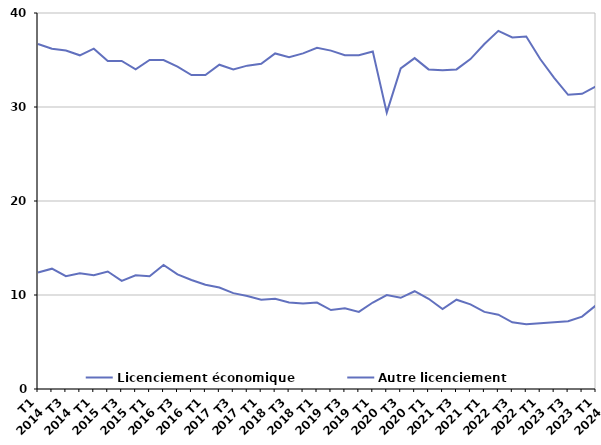
| Category | Licenciement économique | Autre licenciement |
|---|---|---|
| T1
2014 | 12.4 | 36.7 |
| T2
2014 | 12.8 | 36.2 |
| T3
2014 | 12 | 36 |
| T4
2014 | 12.3 | 35.5 |
| T1
2015 | 12.1 | 36.2 |
| T2
2015 | 12.5 | 34.9 |
| T3
2015 | 11.5 | 34.9 |
| T4
2015 | 12.1 | 34 |
| T1
2016 | 12 | 35 |
| T2
2016 | 13.2 | 35 |
| T3
2016 | 12.2 | 34.3 |
| T4
2016 | 11.6 | 33.4 |
| T1
2017 | 11.1 | 33.4 |
| T2
2017 | 10.8 | 34.5 |
| T3
2017 | 10.2 | 34 |
| T4
2017 | 9.9 | 34.4 |
| T1
2018 | 9.5 | 34.6 |
| T2
2018 | 9.6 | 35.7 |
| T3
2018 | 9.2 | 35.3 |
| T4
2018 | 9.1 | 35.7 |
| T1
2019 | 9.2 | 36.3 |
| T2
2019 | 8.4 | 36 |
| T3
2019 | 8.6 | 35.5 |
| T4
2019 | 8.2 | 35.5 |
| T1
2020 | 9.2 | 35.9 |
| T2
2020 | 10 | 29.4 |
| T3
2020 | 9.7 | 34.1 |
| T4
2020 | 10.4 | 35.2 |
| T1
2021 | 9.6 | 34 |
| T2
2021 | 8.5 | 33.9 |
| T3
2021 | 9.5 | 34 |
| T4
2021 | 9 | 35.1 |
| T1
2022 | 8.2 | 36.7 |
| T2
2022 | 7.9 | 38.1 |
| T3
2022 | 7.1 | 37.4 |
| T4
2022 | 6.9 | 37.5 |
| T1
2023 | 7 | 35.1 |
| T2
2023 | 7.1 | 33.1 |
| T3
2023 | 7.2 | 31.3 |
| T4
2023 | 7.7 | 31.4 |
| T1
2024 | 8.9 | 32.2 |